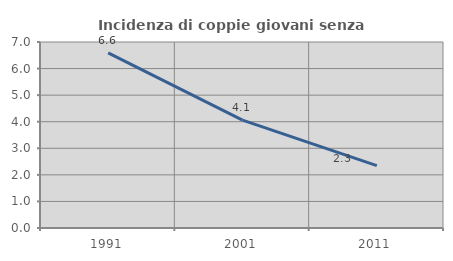
| Category | Incidenza di coppie giovani senza figli |
|---|---|
| 1991.0 | 6.59 |
| 2001.0 | 4.058 |
| 2011.0 | 2.346 |